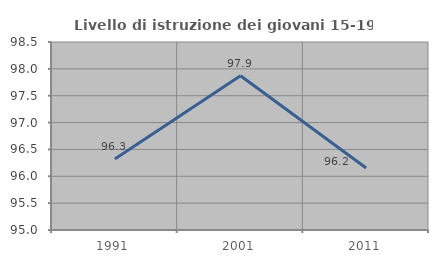
| Category | Livello di istruzione dei giovani 15-19 anni |
|---|---|
| 1991.0 | 96.324 |
| 2001.0 | 97.872 |
| 2011.0 | 96.154 |